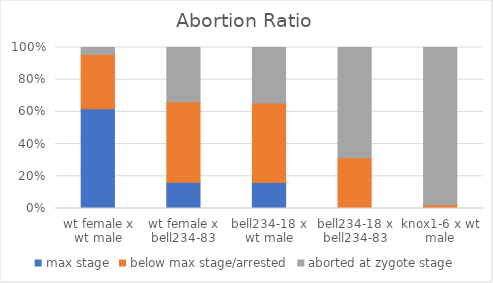
| Category | max stage | below max stage/arrested | aborted at zygote stage |
|---|---|---|---|
| wt female x wt male | 61.957 | 33.696 | 4.348 |
| wt female x bell234-83 | 16.327 | 50 | 33.673 |
| bell234-18 x wt male | 16.216 | 49.324 | 34.459 |
| bell234-18 x bell234-83 | 0 | 31.579 | 68.421 |
| knox1-6 x wt male | 0 | 2.326 | 97.674 |